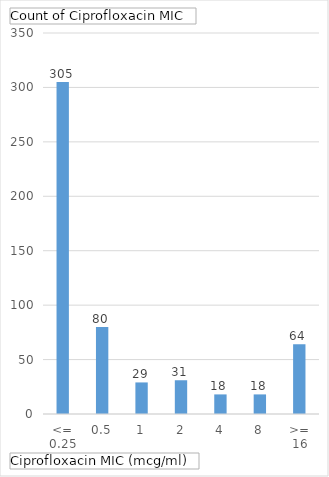
| Category | Total |
|---|---|
| <= 0.25 | 305 |
| 0.5 | 80 |
| 1 | 29 |
| 2 | 31 |
| 4 | 18 |
| 8 | 18 |
| >= 16 | 64 |